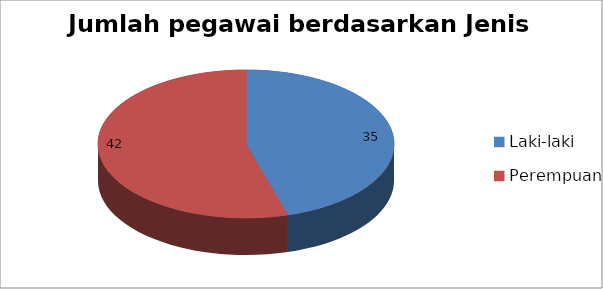
| Category | Jlh |
|---|---|
| Laki-laki | 35 |
| Perempuan | 42 |